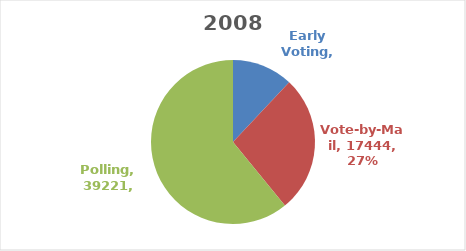
| Category | Series 0 |
|---|---|
| Early Voting | 7731 |
| Vote-by-Mail | 17444 |
| Polling | 39221 |